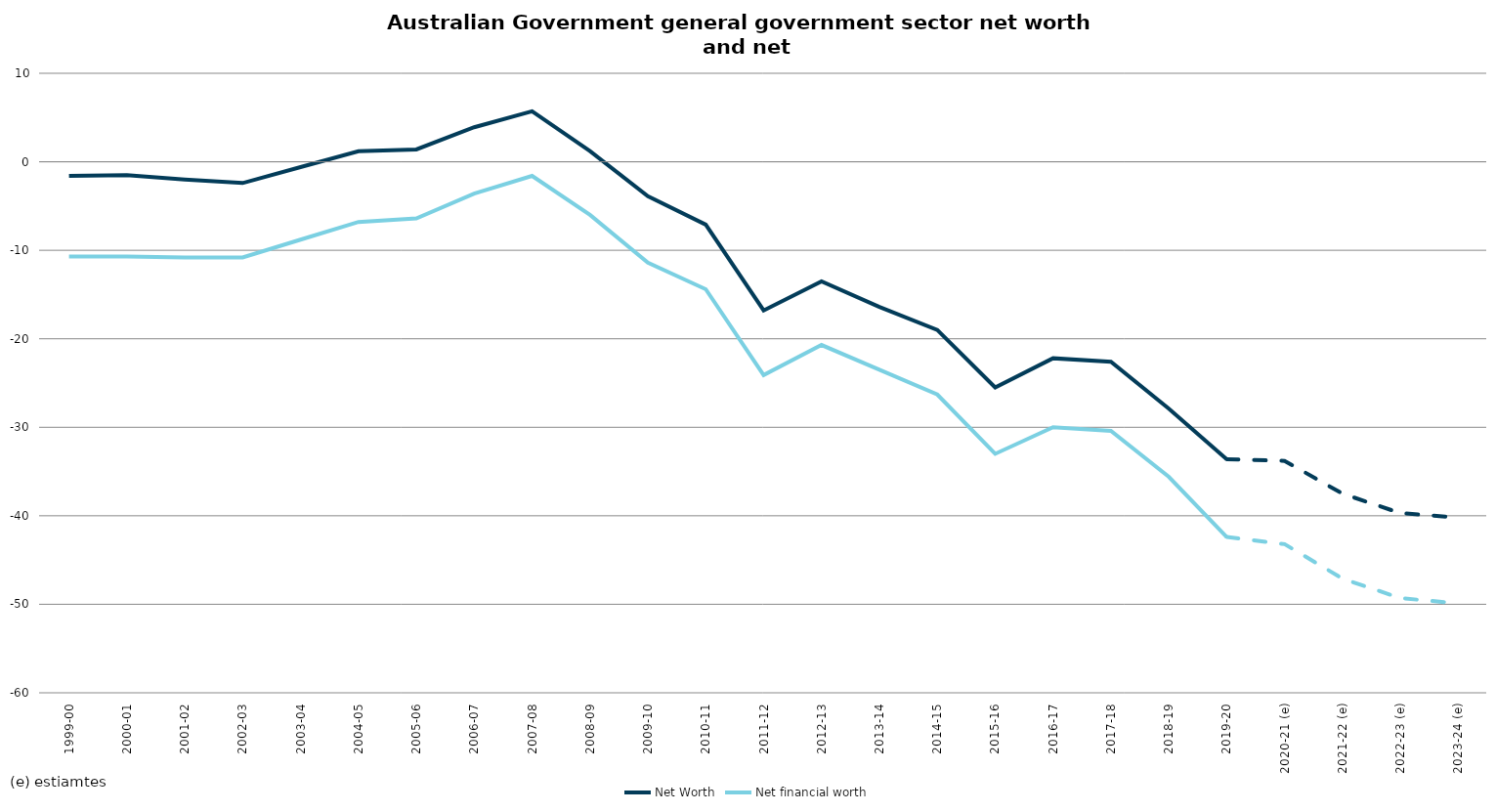
| Category | Net Worth | Net financial worth |
|---|---|---|
| 1999-00 | -1.6 | -10.7 |
| 2000-01 | -1.5 | -10.7 |
| 2001-02 | -2 | -10.8 |
| 2002-03 | -2.4 | -10.8 |
| 2003-04 | -0.6 | -8.8 |
| 2004-05 | 1.2 | -6.8 |
| 2005-06 | 1.4 | -6.4 |
| 2006-07 | 3.9 | -3.6 |
| 2007-08 | 5.7 | -1.6 |
| 2008-09 | 1.2 | -6 |
| 2009-10 | -3.9 | -11.4 |
| 2010-11 | -7.1 | -14.4 |
| 2011-12 | -16.8 | -24.1 |
| 2012-13 | -13.5 | -20.7 |
| 2013-14 | -16.4 | -23.5 |
| 2014-15 | -19 | -26.3 |
| 2015-16 | -25.5 | -33 |
| 2016-17 | -22.2 | -30 |
| 2017-18 | -22.6 | -30.4 |
| 2018-19 | -27.9 | -35.6 |
| 2019-20 | -33.6 | -42.4 |
| 2020-21 (e) | -33.8 | -43.2 |
| 2021-22 (e) | -37.5 | -47.1 |
| 2022-23 (e) | -39.7 | -49.3 |
| 2023-24 (e) | -40.2 | -49.9 |